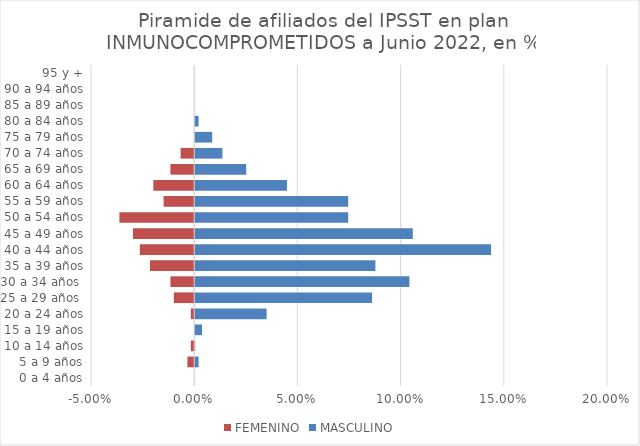
| Category | FEMENINO | MASCULINO |
|---|---|---|
| 0 a 4 años | 0 | 0 |
| 5 a 9 años | -0.003 | 0.002 |
| 10 a 14 años | -0.002 | 0 |
| 15 a 19 años | 0 | 0.003 |
| 20 a 24 años | -0.002 | 0.035 |
| 25 a 29 años  | -0.01 | 0.086 |
| 30 a 34 años  | -0.012 | 0.104 |
| 35 a 39 años | -0.021 | 0.087 |
| 40 a 44 años | -0.026 | 0.143 |
| 45 a 49 años | -0.03 | 0.105 |
| 50 a 54 años | -0.036 | 0.074 |
| 55 a 59 años | -0.015 | 0.074 |
| 60 a 64 años | -0.02 | 0.044 |
| 65 a 69 años | -0.012 | 0.025 |
| 70 a 74 años | -0.007 | 0.013 |
| 75 a 79 años | 0 | 0.008 |
| 80 a 84 años | 0 | 0.002 |
| 85 a 89 años | 0 | 0 |
| 90 a 94 años | 0 | 0 |
| 95 y + | 0 | 0 |